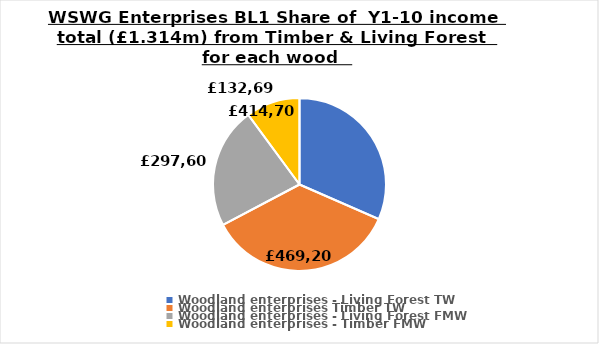
| Category | Series 0 |
|---|---|
| Woodland enterprises - Living Forest TW | 414705 |
| Woodland enterprises Timber TW | 469203 |
| Woodland enterprises - Living Forest FMW | 297600 |
| Woodland enterprises - Timber FMW | 132696 |